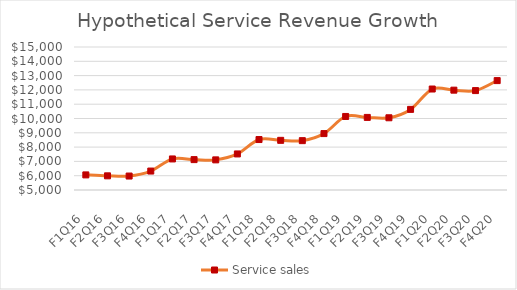
| Category | Service sales |
|---|---|
| F1Q16 | 6056 |
| F2Q16 | 5991 |
| F3Q16 | 5976 |
| F4Q16 | 6325 |
| F1Q17 | 7172 |
| F2Q17 | 7124.54 |
| F3Q17 | 7106.702 |
| F4Q17 | 7521.735 |
| F1Q18 | 8528.993 |
| F2Q18 | 8472.553 |
| F3Q18 | 8451.34 |
| F4Q18 | 8944.901 |
| F1Q19 | 10142.74 |
| F2Q19 | 10075.621 |
| F3Q19 | 10050.394 |
| F4Q19 | 10637.34 |
| F1Q20 | 12061.818 |
| F2Q20 | 11982 |
| F3Q20 | 11952 |
| F4Q20 | 12650 |